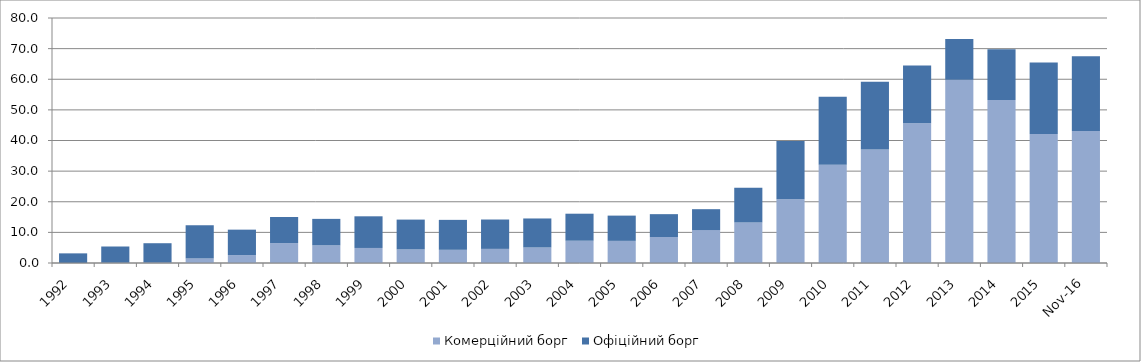
| Category | Комерційний борг | Офіційний борг |
|---|---|---|
| 1992.0 | 0.002 | 3.145 |
| 1993.0 | 0.093 | 5.294 |
| 1994.0 | 0.141 | 6.319 |
| 1995.0 | 1.452 | 10.845 |
| 1996.0 | 2.584 | 8.306 |
| 1997.0 | 6.501 | 8.515 |
| 1998.0 | 5.762 | 8.647 |
| 1999.0 | 4.91 | 10.338 |
| 2000.0 | 4.437 | 9.735 |
| 2001.0 | 4.31 | 9.775 |
| 2002.0 | 4.609 | 9.593 |
| 2003.0 | 5.066 | 9.477 |
| 2004.0 | 7.274 | 8.823 |
| 2005.0 | 7.225 | 8.249 |
| 2006.0 | 8.489 | 7.461 |
| 2007.0 | 10.762 | 6.811 |
| 2008.0 | 13.215 | 11.384 |
| 2009.0 | 20.831 | 18.982 |
| 2010.0 | 32.087 | 22.211 |
| 2011.0 | 37.025 | 22.198 |
| 2012.0 | 45.621 | 18.875 |
| 2013.0 | 59.842 | 13.321 |
| 2014.0 | 53.19 | 16.622 |
| 2015.0 | 42.095 | 23.41 |
| 42704.0 | 43.1 | 24.436 |